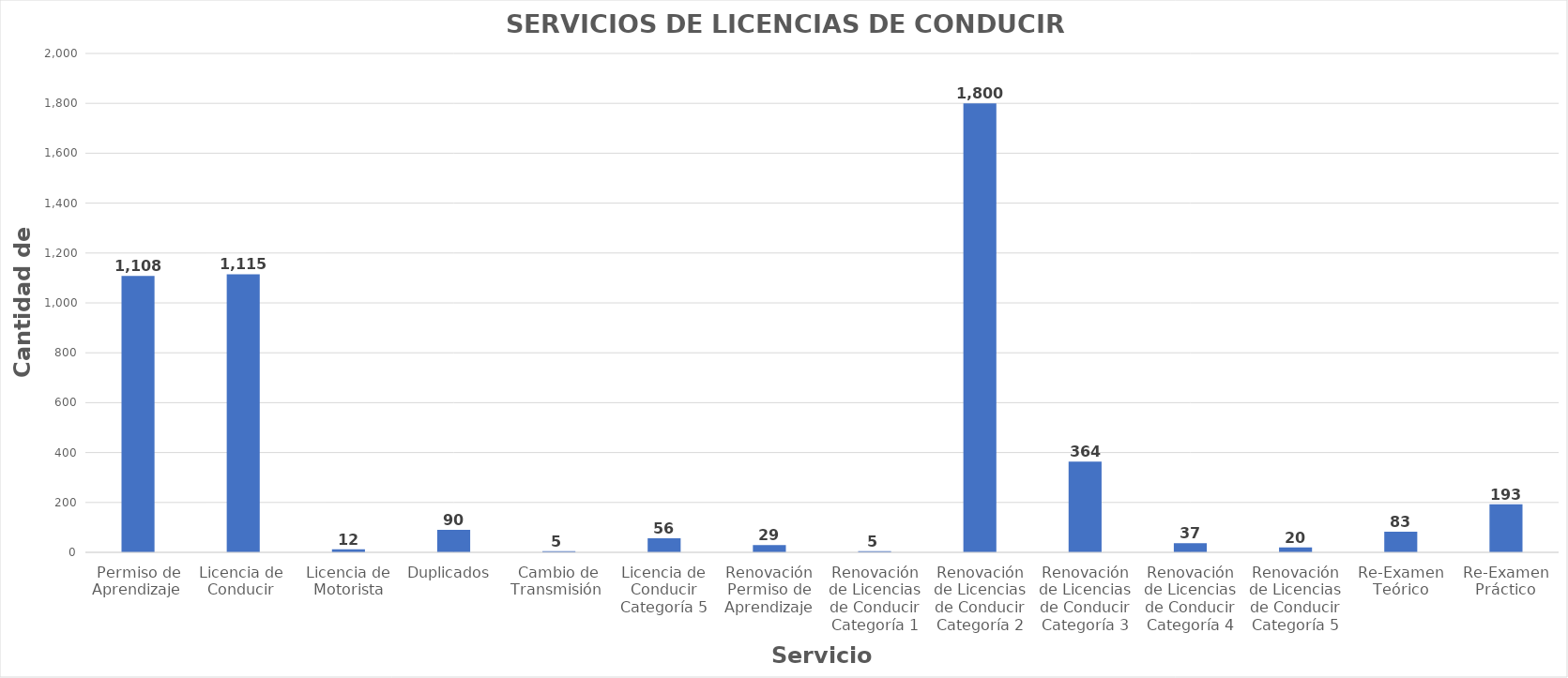
| Category | Series 0 |
|---|---|
| Permiso de Aprendizaje  | 1108 |
| Licencia de  Conducir  | 1115 |
| Licencia de Motorista | 12 |
| Duplicados  | 90 |
| Cambio de Transmisión  | 5 |
| Licencia de Conducir Categoría 5 | 56 |
| Renovación Permiso de Aprendizaje | 29 |
| Renovación de Licencias de Conducir Categoría 1 | 5 |
| Renovación de Licencias de Conducir Categoría 2 | 1800 |
| Renovación de Licencias de Conducir Categoría 3 | 364 |
| Renovación de Licencias de Conducir Categoría 4 | 37 |
| Renovación de Licencias de Conducir Categoría 5 | 20 |
| Re-Examen Teórico | 83 |
| Re-Examen Práctico | 193 |